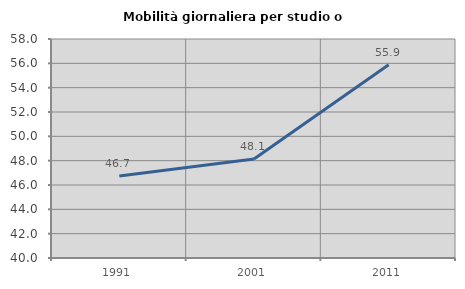
| Category | Mobilità giornaliera per studio o lavoro |
|---|---|
| 1991.0 | 46.737 |
| 2001.0 | 48.143 |
| 2011.0 | 55.888 |